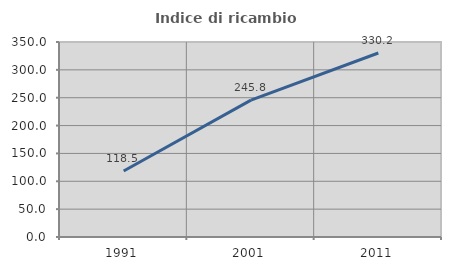
| Category | Indice di ricambio occupazionale  |
|---|---|
| 1991.0 | 118.545 |
| 2001.0 | 245.769 |
| 2011.0 | 330.224 |